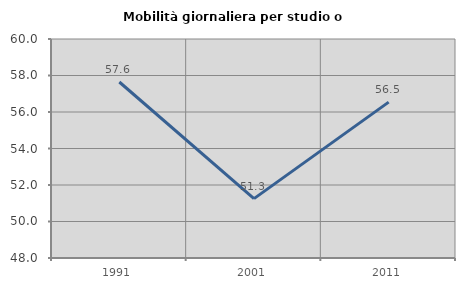
| Category | Mobilità giornaliera per studio o lavoro |
|---|---|
| 1991.0 | 57.644 |
| 2001.0 | 51.253 |
| 2011.0 | 56.542 |